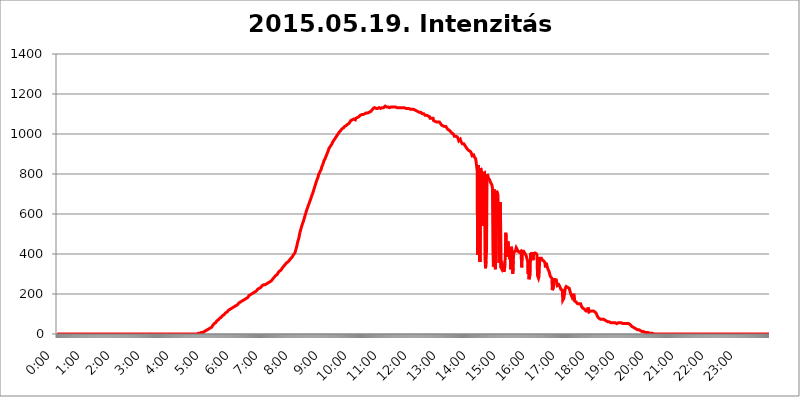
| Category | 2015.05.19. Intenzitás [W/m^2] |
|---|---|
| 0.0 | 0 |
| 0.0006944444444444445 | 0 |
| 0.001388888888888889 | 0 |
| 0.0020833333333333333 | 0 |
| 0.002777777777777778 | 0 |
| 0.003472222222222222 | 0 |
| 0.004166666666666667 | 0 |
| 0.004861111111111111 | 0 |
| 0.005555555555555556 | 0 |
| 0.0062499999999999995 | 0 |
| 0.006944444444444444 | 0 |
| 0.007638888888888889 | 0 |
| 0.008333333333333333 | 0 |
| 0.009027777777777779 | 0 |
| 0.009722222222222222 | 0 |
| 0.010416666666666666 | 0 |
| 0.011111111111111112 | 0 |
| 0.011805555555555555 | 0 |
| 0.012499999999999999 | 0 |
| 0.013194444444444444 | 0 |
| 0.013888888888888888 | 0 |
| 0.014583333333333332 | 0 |
| 0.015277777777777777 | 0 |
| 0.015972222222222224 | 0 |
| 0.016666666666666666 | 0 |
| 0.017361111111111112 | 0 |
| 0.018055555555555557 | 0 |
| 0.01875 | 0 |
| 0.019444444444444445 | 0 |
| 0.02013888888888889 | 0 |
| 0.020833333333333332 | 0 |
| 0.02152777777777778 | 0 |
| 0.022222222222222223 | 0 |
| 0.02291666666666667 | 0 |
| 0.02361111111111111 | 0 |
| 0.024305555555555556 | 0 |
| 0.024999999999999998 | 0 |
| 0.025694444444444447 | 0 |
| 0.02638888888888889 | 0 |
| 0.027083333333333334 | 0 |
| 0.027777777777777776 | 0 |
| 0.02847222222222222 | 0 |
| 0.029166666666666664 | 0 |
| 0.029861111111111113 | 0 |
| 0.030555555555555555 | 0 |
| 0.03125 | 0 |
| 0.03194444444444445 | 0 |
| 0.03263888888888889 | 0 |
| 0.03333333333333333 | 0 |
| 0.034027777777777775 | 0 |
| 0.034722222222222224 | 0 |
| 0.035416666666666666 | 0 |
| 0.036111111111111115 | 0 |
| 0.03680555555555556 | 0 |
| 0.0375 | 0 |
| 0.03819444444444444 | 0 |
| 0.03888888888888889 | 0 |
| 0.03958333333333333 | 0 |
| 0.04027777777777778 | 0 |
| 0.04097222222222222 | 0 |
| 0.041666666666666664 | 0 |
| 0.042361111111111106 | 0 |
| 0.04305555555555556 | 0 |
| 0.043750000000000004 | 0 |
| 0.044444444444444446 | 0 |
| 0.04513888888888889 | 0 |
| 0.04583333333333334 | 0 |
| 0.04652777777777778 | 0 |
| 0.04722222222222222 | 0 |
| 0.04791666666666666 | 0 |
| 0.04861111111111111 | 0 |
| 0.049305555555555554 | 0 |
| 0.049999999999999996 | 0 |
| 0.05069444444444445 | 0 |
| 0.051388888888888894 | 0 |
| 0.052083333333333336 | 0 |
| 0.05277777777777778 | 0 |
| 0.05347222222222222 | 0 |
| 0.05416666666666667 | 0 |
| 0.05486111111111111 | 0 |
| 0.05555555555555555 | 0 |
| 0.05625 | 0 |
| 0.05694444444444444 | 0 |
| 0.057638888888888885 | 0 |
| 0.05833333333333333 | 0 |
| 0.05902777777777778 | 0 |
| 0.059722222222222225 | 0 |
| 0.06041666666666667 | 0 |
| 0.061111111111111116 | 0 |
| 0.06180555555555556 | 0 |
| 0.0625 | 0 |
| 0.06319444444444444 | 0 |
| 0.06388888888888888 | 0 |
| 0.06458333333333334 | 0 |
| 0.06527777777777778 | 0 |
| 0.06597222222222222 | 0 |
| 0.06666666666666667 | 0 |
| 0.06736111111111111 | 0 |
| 0.06805555555555555 | 0 |
| 0.06874999999999999 | 0 |
| 0.06944444444444443 | 0 |
| 0.07013888888888889 | 0 |
| 0.07083333333333333 | 0 |
| 0.07152777777777779 | 0 |
| 0.07222222222222223 | 0 |
| 0.07291666666666667 | 0 |
| 0.07361111111111111 | 0 |
| 0.07430555555555556 | 0 |
| 0.075 | 0 |
| 0.07569444444444444 | 0 |
| 0.0763888888888889 | 0 |
| 0.07708333333333334 | 0 |
| 0.07777777777777778 | 0 |
| 0.07847222222222222 | 0 |
| 0.07916666666666666 | 0 |
| 0.0798611111111111 | 0 |
| 0.08055555555555556 | 0 |
| 0.08125 | 0 |
| 0.08194444444444444 | 0 |
| 0.08263888888888889 | 0 |
| 0.08333333333333333 | 0 |
| 0.08402777777777777 | 0 |
| 0.08472222222222221 | 0 |
| 0.08541666666666665 | 0 |
| 0.08611111111111112 | 0 |
| 0.08680555555555557 | 0 |
| 0.08750000000000001 | 0 |
| 0.08819444444444445 | 0 |
| 0.08888888888888889 | 0 |
| 0.08958333333333333 | 0 |
| 0.09027777777777778 | 0 |
| 0.09097222222222222 | 0 |
| 0.09166666666666667 | 0 |
| 0.09236111111111112 | 0 |
| 0.09305555555555556 | 0 |
| 0.09375 | 0 |
| 0.09444444444444444 | 0 |
| 0.09513888888888888 | 0 |
| 0.09583333333333333 | 0 |
| 0.09652777777777777 | 0 |
| 0.09722222222222222 | 0 |
| 0.09791666666666667 | 0 |
| 0.09861111111111111 | 0 |
| 0.09930555555555555 | 0 |
| 0.09999999999999999 | 0 |
| 0.10069444444444443 | 0 |
| 0.1013888888888889 | 0 |
| 0.10208333333333335 | 0 |
| 0.10277777777777779 | 0 |
| 0.10347222222222223 | 0 |
| 0.10416666666666667 | 0 |
| 0.10486111111111111 | 0 |
| 0.10555555555555556 | 0 |
| 0.10625 | 0 |
| 0.10694444444444444 | 0 |
| 0.1076388888888889 | 0 |
| 0.10833333333333334 | 0 |
| 0.10902777777777778 | 0 |
| 0.10972222222222222 | 0 |
| 0.1111111111111111 | 0 |
| 0.11180555555555556 | 0 |
| 0.11180555555555556 | 0 |
| 0.1125 | 0 |
| 0.11319444444444444 | 0 |
| 0.11388888888888889 | 0 |
| 0.11458333333333333 | 0 |
| 0.11527777777777777 | 0 |
| 0.11597222222222221 | 0 |
| 0.11666666666666665 | 0 |
| 0.1173611111111111 | 0 |
| 0.11805555555555557 | 0 |
| 0.11944444444444445 | 0 |
| 0.12013888888888889 | 0 |
| 0.12083333333333333 | 0 |
| 0.12152777777777778 | 0 |
| 0.12222222222222223 | 0 |
| 0.12291666666666667 | 0 |
| 0.12291666666666667 | 0 |
| 0.12361111111111112 | 0 |
| 0.12430555555555556 | 0 |
| 0.125 | 0 |
| 0.12569444444444444 | 0 |
| 0.12638888888888888 | 0 |
| 0.12708333333333333 | 0 |
| 0.16875 | 0 |
| 0.12847222222222224 | 0 |
| 0.12916666666666668 | 0 |
| 0.12986111111111112 | 0 |
| 0.13055555555555556 | 0 |
| 0.13125 | 0 |
| 0.13194444444444445 | 0 |
| 0.1326388888888889 | 0 |
| 0.13333333333333333 | 0 |
| 0.13402777777777777 | 0 |
| 0.13402777777777777 | 0 |
| 0.13472222222222222 | 0 |
| 0.13541666666666666 | 0 |
| 0.1361111111111111 | 0 |
| 0.13749999999999998 | 0 |
| 0.13819444444444443 | 0 |
| 0.1388888888888889 | 0 |
| 0.13958333333333334 | 0 |
| 0.14027777777777778 | 0 |
| 0.14097222222222222 | 0 |
| 0.14166666666666666 | 0 |
| 0.1423611111111111 | 0 |
| 0.14305555555555557 | 0 |
| 0.14375000000000002 | 0 |
| 0.14444444444444446 | 0 |
| 0.1451388888888889 | 0 |
| 0.1451388888888889 | 0 |
| 0.14652777777777778 | 0 |
| 0.14722222222222223 | 0 |
| 0.14791666666666667 | 0 |
| 0.1486111111111111 | 0 |
| 0.14930555555555555 | 0 |
| 0.15 | 0 |
| 0.15069444444444444 | 0 |
| 0.15138888888888888 | 0 |
| 0.15208333333333332 | 0 |
| 0.15277777777777776 | 0 |
| 0.15347222222222223 | 0 |
| 0.15416666666666667 | 0 |
| 0.15486111111111112 | 0 |
| 0.15555555555555556 | 0 |
| 0.15625 | 0 |
| 0.15694444444444444 | 0 |
| 0.15763888888888888 | 0 |
| 0.15833333333333333 | 0 |
| 0.15902777777777777 | 0 |
| 0.15972222222222224 | 0 |
| 0.16041666666666668 | 0 |
| 0.16111111111111112 | 0 |
| 0.16180555555555556 | 0 |
| 0.1625 | 0 |
| 0.16319444444444445 | 0 |
| 0.1638888888888889 | 0 |
| 0.16458333333333333 | 0 |
| 0.16527777777777777 | 0 |
| 0.16597222222222222 | 0 |
| 0.16666666666666666 | 0 |
| 0.1673611111111111 | 0 |
| 0.16805555555555554 | 0 |
| 0.16874999999999998 | 0 |
| 0.16944444444444443 | 0 |
| 0.17013888888888887 | 0 |
| 0.1708333333333333 | 0 |
| 0.17152777777777775 | 0 |
| 0.17222222222222225 | 0 |
| 0.1729166666666667 | 0 |
| 0.17361111111111113 | 0 |
| 0.17430555555555557 | 0 |
| 0.17500000000000002 | 0 |
| 0.17569444444444446 | 0 |
| 0.1763888888888889 | 0 |
| 0.17708333333333334 | 0 |
| 0.17777777777777778 | 0 |
| 0.17847222222222223 | 0 |
| 0.17916666666666667 | 0 |
| 0.1798611111111111 | 0 |
| 0.18055555555555555 | 0 |
| 0.18125 | 0 |
| 0.18194444444444444 | 0 |
| 0.1826388888888889 | 0 |
| 0.18333333333333335 | 0 |
| 0.1840277777777778 | 0 |
| 0.18472222222222223 | 0 |
| 0.18541666666666667 | 0 |
| 0.18611111111111112 | 0 |
| 0.18680555555555556 | 0 |
| 0.1875 | 0 |
| 0.18819444444444444 | 0 |
| 0.18888888888888888 | 0 |
| 0.18958333333333333 | 0 |
| 0.19027777777777777 | 0 |
| 0.1909722222222222 | 0 |
| 0.19166666666666665 | 0 |
| 0.19236111111111112 | 0 |
| 0.19305555555555554 | 0 |
| 0.19375 | 0 |
| 0.19444444444444445 | 0 |
| 0.1951388888888889 | 0 |
| 0.19583333333333333 | 0 |
| 0.19652777777777777 | 0 |
| 0.19722222222222222 | 3.525 |
| 0.19791666666666666 | 3.525 |
| 0.1986111111111111 | 3.525 |
| 0.19930555555555554 | 3.525 |
| 0.19999999999999998 | 3.525 |
| 0.20069444444444443 | 3.525 |
| 0.20138888888888887 | 3.525 |
| 0.2020833333333333 | 7.887 |
| 0.2027777777777778 | 7.887 |
| 0.2034722222222222 | 7.887 |
| 0.2041666666666667 | 7.887 |
| 0.20486111111111113 | 12.257 |
| 0.20555555555555557 | 12.257 |
| 0.20625000000000002 | 12.257 |
| 0.20694444444444446 | 12.257 |
| 0.2076388888888889 | 16.636 |
| 0.20833333333333334 | 16.636 |
| 0.20902777777777778 | 16.636 |
| 0.20972222222222223 | 21.024 |
| 0.21041666666666667 | 21.024 |
| 0.2111111111111111 | 21.024 |
| 0.21180555555555555 | 21.024 |
| 0.2125 | 25.419 |
| 0.21319444444444444 | 25.419 |
| 0.2138888888888889 | 29.823 |
| 0.21458333333333335 | 29.823 |
| 0.2152777777777778 | 29.823 |
| 0.21597222222222223 | 34.234 |
| 0.21666666666666667 | 34.234 |
| 0.21736111111111112 | 38.653 |
| 0.21805555555555556 | 43.079 |
| 0.21875 | 43.079 |
| 0.21944444444444444 | 47.511 |
| 0.22013888888888888 | 51.951 |
| 0.22083333333333333 | 51.951 |
| 0.22152777777777777 | 56.398 |
| 0.2222222222222222 | 56.398 |
| 0.22291666666666665 | 60.85 |
| 0.2236111111111111 | 65.31 |
| 0.22430555555555556 | 65.31 |
| 0.225 | 69.775 |
| 0.22569444444444445 | 69.775 |
| 0.2263888888888889 | 74.246 |
| 0.22708333333333333 | 74.246 |
| 0.22777777777777777 | 78.722 |
| 0.22847222222222222 | 78.722 |
| 0.22916666666666666 | 83.205 |
| 0.2298611111111111 | 83.205 |
| 0.23055555555555554 | 87.692 |
| 0.23124999999999998 | 87.692 |
| 0.23194444444444443 | 92.184 |
| 0.23263888888888887 | 92.184 |
| 0.2333333333333333 | 96.682 |
| 0.2340277777777778 | 96.682 |
| 0.2347222222222222 | 101.184 |
| 0.2354166666666667 | 101.184 |
| 0.23611111111111113 | 105.69 |
| 0.23680555555555557 | 105.69 |
| 0.23750000000000002 | 110.201 |
| 0.23819444444444446 | 110.201 |
| 0.2388888888888889 | 114.716 |
| 0.23958333333333334 | 114.716 |
| 0.24027777777777778 | 119.235 |
| 0.24097222222222223 | 119.235 |
| 0.24166666666666667 | 119.235 |
| 0.2423611111111111 | 123.758 |
| 0.24305555555555555 | 123.758 |
| 0.24375 | 128.284 |
| 0.24444444444444446 | 128.284 |
| 0.24513888888888888 | 128.284 |
| 0.24583333333333335 | 132.814 |
| 0.2465277777777778 | 132.814 |
| 0.24722222222222223 | 132.814 |
| 0.24791666666666667 | 137.347 |
| 0.24861111111111112 | 137.347 |
| 0.24930555555555556 | 137.347 |
| 0.25 | 141.884 |
| 0.25069444444444444 | 141.884 |
| 0.2513888888888889 | 146.423 |
| 0.2520833333333333 | 146.423 |
| 0.25277777777777777 | 146.423 |
| 0.2534722222222222 | 150.964 |
| 0.25416666666666665 | 150.964 |
| 0.2548611111111111 | 155.509 |
| 0.2555555555555556 | 155.509 |
| 0.25625000000000003 | 155.509 |
| 0.2569444444444445 | 160.056 |
| 0.2576388888888889 | 160.056 |
| 0.25833333333333336 | 164.605 |
| 0.2590277777777778 | 164.605 |
| 0.25972222222222224 | 164.605 |
| 0.2604166666666667 | 169.156 |
| 0.2611111111111111 | 169.156 |
| 0.26180555555555557 | 173.709 |
| 0.2625 | 173.709 |
| 0.26319444444444445 | 173.709 |
| 0.2638888888888889 | 173.709 |
| 0.26458333333333334 | 178.264 |
| 0.2652777777777778 | 178.264 |
| 0.2659722222222222 | 178.264 |
| 0.26666666666666666 | 182.82 |
| 0.2673611111111111 | 182.82 |
| 0.26805555555555555 | 187.378 |
| 0.26875 | 191.937 |
| 0.26944444444444443 | 191.937 |
| 0.2701388888888889 | 191.937 |
| 0.2708333333333333 | 196.497 |
| 0.27152777777777776 | 196.497 |
| 0.2722222222222222 | 201.058 |
| 0.27291666666666664 | 201.058 |
| 0.2736111111111111 | 201.058 |
| 0.2743055555555555 | 205.62 |
| 0.27499999999999997 | 205.62 |
| 0.27569444444444446 | 210.182 |
| 0.27638888888888885 | 210.182 |
| 0.27708333333333335 | 210.182 |
| 0.2777777777777778 | 210.182 |
| 0.27847222222222223 | 214.746 |
| 0.2791666666666667 | 214.746 |
| 0.2798611111111111 | 219.309 |
| 0.28055555555555556 | 219.309 |
| 0.28125 | 223.873 |
| 0.28194444444444444 | 223.873 |
| 0.2826388888888889 | 228.436 |
| 0.2833333333333333 | 228.436 |
| 0.28402777777777777 | 233 |
| 0.2847222222222222 | 233 |
| 0.28541666666666665 | 233 |
| 0.28611111111111115 | 237.564 |
| 0.28680555555555554 | 237.564 |
| 0.28750000000000003 | 242.127 |
| 0.2881944444444445 | 242.127 |
| 0.2888888888888889 | 242.127 |
| 0.28958333333333336 | 246.689 |
| 0.2902777777777778 | 246.689 |
| 0.29097222222222224 | 246.689 |
| 0.2916666666666667 | 246.689 |
| 0.2923611111111111 | 251.251 |
| 0.29305555555555557 | 251.251 |
| 0.29375 | 251.251 |
| 0.29444444444444445 | 251.251 |
| 0.2951388888888889 | 255.813 |
| 0.29583333333333334 | 255.813 |
| 0.2965277777777778 | 255.813 |
| 0.2972222222222222 | 260.373 |
| 0.29791666666666666 | 260.373 |
| 0.2986111111111111 | 264.932 |
| 0.29930555555555555 | 264.932 |
| 0.3 | 264.932 |
| 0.30069444444444443 | 264.932 |
| 0.3013888888888889 | 269.49 |
| 0.3020833333333333 | 274.047 |
| 0.30277777777777776 | 274.047 |
| 0.3034722222222222 | 278.603 |
| 0.30416666666666664 | 283.156 |
| 0.3048611111111111 | 283.156 |
| 0.3055555555555555 | 287.709 |
| 0.30624999999999997 | 292.259 |
| 0.3069444444444444 | 292.259 |
| 0.3076388888888889 | 296.808 |
| 0.30833333333333335 | 296.808 |
| 0.3090277777777778 | 301.354 |
| 0.30972222222222223 | 305.898 |
| 0.3104166666666667 | 305.898 |
| 0.3111111111111111 | 310.44 |
| 0.31180555555555556 | 314.98 |
| 0.3125 | 314.98 |
| 0.31319444444444444 | 319.517 |
| 0.3138888888888889 | 319.517 |
| 0.3145833333333333 | 324.052 |
| 0.31527777777777777 | 328.584 |
| 0.3159722222222222 | 328.584 |
| 0.31666666666666665 | 333.113 |
| 0.31736111111111115 | 337.639 |
| 0.31805555555555554 | 342.162 |
| 0.31875000000000003 | 342.162 |
| 0.3194444444444445 | 346.682 |
| 0.3201388888888889 | 346.682 |
| 0.32083333333333336 | 351.198 |
| 0.3215277777777778 | 355.712 |
| 0.32222222222222224 | 355.712 |
| 0.3229166666666667 | 360.221 |
| 0.3236111111111111 | 360.221 |
| 0.32430555555555557 | 364.728 |
| 0.325 | 364.728 |
| 0.32569444444444445 | 369.23 |
| 0.3263888888888889 | 373.729 |
| 0.32708333333333334 | 373.729 |
| 0.3277777777777778 | 378.224 |
| 0.3284722222222222 | 378.224 |
| 0.32916666666666666 | 382.715 |
| 0.3298611111111111 | 387.202 |
| 0.33055555555555555 | 391.685 |
| 0.33125 | 396.164 |
| 0.33194444444444443 | 396.164 |
| 0.3326388888888889 | 400.638 |
| 0.3333333333333333 | 405.108 |
| 0.3340277777777778 | 414.035 |
| 0.3347222222222222 | 422.943 |
| 0.3354166666666667 | 431.833 |
| 0.3361111111111111 | 440.702 |
| 0.3368055555555556 | 453.968 |
| 0.33749999999999997 | 462.786 |
| 0.33819444444444446 | 471.582 |
| 0.33888888888888885 | 480.356 |
| 0.33958333333333335 | 493.475 |
| 0.34027777777777773 | 506.542 |
| 0.34097222222222223 | 515.223 |
| 0.3416666666666666 | 523.88 |
| 0.3423611111111111 | 532.513 |
| 0.3430555555555555 | 541.121 |
| 0.34375 | 549.704 |
| 0.3444444444444445 | 553.986 |
| 0.3451388888888889 | 562.53 |
| 0.3458333333333334 | 571.049 |
| 0.34652777777777777 | 579.542 |
| 0.34722222222222227 | 588.009 |
| 0.34791666666666665 | 596.45 |
| 0.34861111111111115 | 604.864 |
| 0.34930555555555554 | 613.252 |
| 0.35000000000000003 | 621.613 |
| 0.3506944444444444 | 625.784 |
| 0.3513888888888889 | 634.105 |
| 0.3520833333333333 | 642.4 |
| 0.3527777777777778 | 646.537 |
| 0.3534722222222222 | 654.791 |
| 0.3541666666666667 | 663.019 |
| 0.3548611111111111 | 667.123 |
| 0.35555555555555557 | 675.311 |
| 0.35625 | 683.473 |
| 0.35694444444444445 | 691.608 |
| 0.3576388888888889 | 695.666 |
| 0.35833333333333334 | 703.762 |
| 0.3590277777777778 | 711.832 |
| 0.3597222222222222 | 719.877 |
| 0.36041666666666666 | 727.896 |
| 0.3611111111111111 | 731.896 |
| 0.36180555555555555 | 743.859 |
| 0.3625 | 751.803 |
| 0.36319444444444443 | 759.723 |
| 0.3638888888888889 | 767.62 |
| 0.3645833333333333 | 771.559 |
| 0.3652777777777778 | 779.42 |
| 0.3659722222222222 | 787.258 |
| 0.3666666666666667 | 798.974 |
| 0.3673611111111111 | 798.974 |
| 0.3680555555555556 | 806.757 |
| 0.36874999999999997 | 814.519 |
| 0.36944444444444446 | 818.392 |
| 0.37013888888888885 | 822.26 |
| 0.37083333333333335 | 833.834 |
| 0.37152777777777773 | 837.682 |
| 0.37222222222222223 | 845.365 |
| 0.3729166666666666 | 853.029 |
| 0.3736111111111111 | 860.676 |
| 0.3743055555555555 | 868.305 |
| 0.375 | 872.114 |
| 0.3756944444444445 | 875.918 |
| 0.3763888888888889 | 883.516 |
| 0.3770833333333334 | 887.309 |
| 0.37777777777777777 | 894.885 |
| 0.37847222222222227 | 902.447 |
| 0.37916666666666665 | 906.223 |
| 0.37986111111111115 | 913.766 |
| 0.38055555555555554 | 921.298 |
| 0.38125000000000003 | 928.819 |
| 0.3819444444444444 | 932.576 |
| 0.3826388888888889 | 936.33 |
| 0.3833333333333333 | 940.082 |
| 0.3840277777777778 | 943.832 |
| 0.3847222222222222 | 947.58 |
| 0.3854166666666667 | 951.327 |
| 0.3861111111111111 | 958.814 |
| 0.38680555555555557 | 962.555 |
| 0.3875 | 966.295 |
| 0.38819444444444445 | 970.034 |
| 0.3888888888888889 | 973.772 |
| 0.38958333333333334 | 977.508 |
| 0.3902777777777778 | 981.244 |
| 0.3909722222222222 | 984.98 |
| 0.39166666666666666 | 988.714 |
| 0.3923611111111111 | 992.448 |
| 0.39305555555555555 | 996.182 |
| 0.39375 | 996.182 |
| 0.39444444444444443 | 1003.65 |
| 0.3951388888888889 | 1007.383 |
| 0.3958333333333333 | 1011.118 |
| 0.3965277777777778 | 1014.852 |
| 0.3972222222222222 | 1014.852 |
| 0.3979166666666667 | 1018.587 |
| 0.3986111111111111 | 1022.323 |
| 0.3993055555555556 | 1026.06 |
| 0.39999999999999997 | 1026.06 |
| 0.40069444444444446 | 1026.06 |
| 0.40138888888888885 | 1029.798 |
| 0.40208333333333335 | 1033.537 |
| 0.40277777777777773 | 1037.277 |
| 0.40347222222222223 | 1037.277 |
| 0.4041666666666666 | 1041.019 |
| 0.4048611111111111 | 1041.019 |
| 0.4055555555555555 | 1044.762 |
| 0.40625 | 1044.762 |
| 0.4069444444444445 | 1048.508 |
| 0.4076388888888889 | 1048.508 |
| 0.4083333333333334 | 1052.255 |
| 0.40902777777777777 | 1052.255 |
| 0.40972222222222227 | 1056.004 |
| 0.41041666666666665 | 1059.756 |
| 0.41111111111111115 | 1059.756 |
| 0.41180555555555554 | 1067.267 |
| 0.41250000000000003 | 1067.267 |
| 0.4131944444444444 | 1071.027 |
| 0.4138888888888889 | 1071.027 |
| 0.4145833333333333 | 1071.027 |
| 0.4152777777777778 | 1074.789 |
| 0.4159722222222222 | 1074.789 |
| 0.4166666666666667 | 1074.789 |
| 0.4173611111111111 | 1074.789 |
| 0.41805555555555557 | 1071.027 |
| 0.41875 | 1078.555 |
| 0.41944444444444445 | 1078.555 |
| 0.4201388888888889 | 1082.324 |
| 0.42083333333333334 | 1082.324 |
| 0.4215277777777778 | 1082.324 |
| 0.4222222222222222 | 1086.097 |
| 0.42291666666666666 | 1086.097 |
| 0.4236111111111111 | 1086.097 |
| 0.42430555555555555 | 1089.873 |
| 0.425 | 1093.653 |
| 0.42569444444444443 | 1093.653 |
| 0.4263888888888889 | 1093.653 |
| 0.4270833333333333 | 1097.437 |
| 0.4277777777777778 | 1097.437 |
| 0.4284722222222222 | 1097.437 |
| 0.4291666666666667 | 1097.437 |
| 0.4298611111111111 | 1101.226 |
| 0.4305555555555556 | 1101.226 |
| 0.43124999999999997 | 1101.226 |
| 0.43194444444444446 | 1105.019 |
| 0.43263888888888885 | 1101.226 |
| 0.43333333333333335 | 1105.019 |
| 0.43402777777777773 | 1105.019 |
| 0.43472222222222223 | 1108.816 |
| 0.4354166666666666 | 1105.019 |
| 0.4361111111111111 | 1105.019 |
| 0.4368055555555555 | 1108.816 |
| 0.4375 | 1108.816 |
| 0.4381944444444445 | 1112.618 |
| 0.4388888888888889 | 1112.618 |
| 0.4395833333333334 | 1112.618 |
| 0.44027777777777777 | 1112.618 |
| 0.44097222222222227 | 1116.426 |
| 0.44166666666666665 | 1120.238 |
| 0.44236111111111115 | 1124.056 |
| 0.44305555555555554 | 1127.879 |
| 0.44375000000000003 | 1124.056 |
| 0.4444444444444444 | 1127.879 |
| 0.4451388888888889 | 1131.708 |
| 0.4458333333333333 | 1127.879 |
| 0.4465277777777778 | 1127.879 |
| 0.4472222222222222 | 1127.879 |
| 0.4479166666666667 | 1127.879 |
| 0.4486111111111111 | 1131.708 |
| 0.44930555555555557 | 1127.879 |
| 0.45 | 1131.708 |
| 0.45069444444444445 | 1131.708 |
| 0.4513888888888889 | 1131.708 |
| 0.45208333333333334 | 1127.879 |
| 0.4527777777777778 | 1127.879 |
| 0.4534722222222222 | 1127.879 |
| 0.45416666666666666 | 1131.708 |
| 0.4548611111111111 | 1131.708 |
| 0.45555555555555555 | 1131.708 |
| 0.45625 | 1131.708 |
| 0.45694444444444443 | 1131.708 |
| 0.4576388888888889 | 1131.708 |
| 0.4583333333333333 | 1131.708 |
| 0.4590277777777778 | 1131.708 |
| 0.4597222222222222 | 1139.384 |
| 0.4604166666666667 | 1135.543 |
| 0.4611111111111111 | 1135.543 |
| 0.4618055555555556 | 1135.543 |
| 0.46249999999999997 | 1135.543 |
| 0.46319444444444446 | 1135.543 |
| 0.46388888888888885 | 1135.543 |
| 0.46458333333333335 | 1135.543 |
| 0.46527777777777773 | 1135.543 |
| 0.46597222222222223 | 1131.708 |
| 0.4666666666666666 | 1135.543 |
| 0.4673611111111111 | 1135.543 |
| 0.4680555555555555 | 1135.543 |
| 0.46875 | 1135.543 |
| 0.4694444444444445 | 1135.543 |
| 0.4701388888888889 | 1135.543 |
| 0.4708333333333334 | 1135.543 |
| 0.47152777777777777 | 1135.543 |
| 0.47222222222222227 | 1135.543 |
| 0.47291666666666665 | 1135.543 |
| 0.47361111111111115 | 1135.543 |
| 0.47430555555555554 | 1135.543 |
| 0.47500000000000003 | 1135.543 |
| 0.4756944444444444 | 1131.708 |
| 0.4763888888888889 | 1131.708 |
| 0.4770833333333333 | 1131.708 |
| 0.4777777777777778 | 1131.708 |
| 0.4784722222222222 | 1131.708 |
| 0.4791666666666667 | 1131.708 |
| 0.4798611111111111 | 1131.708 |
| 0.48055555555555557 | 1131.708 |
| 0.48125 | 1131.708 |
| 0.48194444444444445 | 1131.708 |
| 0.4826388888888889 | 1131.708 |
| 0.48333333333333334 | 1131.708 |
| 0.4840277777777778 | 1131.708 |
| 0.4847222222222222 | 1131.708 |
| 0.48541666666666666 | 1131.708 |
| 0.4861111111111111 | 1131.708 |
| 0.48680555555555555 | 1131.708 |
| 0.4875 | 1131.708 |
| 0.48819444444444443 | 1127.879 |
| 0.4888888888888889 | 1127.879 |
| 0.4895833333333333 | 1127.879 |
| 0.4902777777777778 | 1127.879 |
| 0.4909722222222222 | 1127.879 |
| 0.4916666666666667 | 1124.056 |
| 0.4923611111111111 | 1127.879 |
| 0.4930555555555556 | 1127.879 |
| 0.49374999999999997 | 1124.056 |
| 0.49444444444444446 | 1124.056 |
| 0.49513888888888885 | 1124.056 |
| 0.49583333333333335 | 1124.056 |
| 0.49652777777777773 | 1124.056 |
| 0.49722222222222223 | 1124.056 |
| 0.4979166666666666 | 1124.056 |
| 0.4986111111111111 | 1124.056 |
| 0.4993055555555555 | 1124.056 |
| 0.5 | 1124.056 |
| 0.5006944444444444 | 1120.238 |
| 0.5013888888888889 | 1120.238 |
| 0.5020833333333333 | 1116.426 |
| 0.5027777777777778 | 1116.426 |
| 0.5034722222222222 | 1116.426 |
| 0.5041666666666667 | 1116.426 |
| 0.5048611111111111 | 1112.618 |
| 0.5055555555555555 | 1112.618 |
| 0.50625 | 1112.618 |
| 0.5069444444444444 | 1112.618 |
| 0.5076388888888889 | 1108.816 |
| 0.5083333333333333 | 1108.816 |
| 0.5090277777777777 | 1108.816 |
| 0.5097222222222222 | 1108.816 |
| 0.5104166666666666 | 1105.019 |
| 0.5111111111111112 | 1105.019 |
| 0.5118055555555555 | 1101.226 |
| 0.5125000000000001 | 1101.226 |
| 0.5131944444444444 | 1101.226 |
| 0.513888888888889 | 1101.226 |
| 0.5145833333333333 | 1101.226 |
| 0.5152777777777778 | 1097.437 |
| 0.5159722222222222 | 1093.653 |
| 0.5166666666666667 | 1093.653 |
| 0.517361111111111 | 1093.653 |
| 0.5180555555555556 | 1093.653 |
| 0.5187499999999999 | 1089.873 |
| 0.5194444444444445 | 1089.873 |
| 0.5201388888888888 | 1089.873 |
| 0.5208333333333334 | 1089.873 |
| 0.5215277777777778 | 1086.097 |
| 0.5222222222222223 | 1086.097 |
| 0.5229166666666667 | 1078.555 |
| 0.5236111111111111 | 1078.555 |
| 0.5243055555555556 | 1078.555 |
| 0.525 | 1078.555 |
| 0.5256944444444445 | 1082.324 |
| 0.5263888888888889 | 1078.555 |
| 0.5270833333333333 | 1078.555 |
| 0.5277777777777778 | 1067.267 |
| 0.5284722222222222 | 1067.267 |
| 0.5291666666666667 | 1063.51 |
| 0.5298611111111111 | 1063.51 |
| 0.5305555555555556 | 1063.51 |
| 0.53125 | 1059.756 |
| 0.5319444444444444 | 1059.756 |
| 0.5326388888888889 | 1059.756 |
| 0.5333333333333333 | 1063.51 |
| 0.5340277777777778 | 1059.756 |
| 0.5347222222222222 | 1059.756 |
| 0.5354166666666667 | 1056.004 |
| 0.5361111111111111 | 1059.756 |
| 0.5368055555555555 | 1056.004 |
| 0.5375 | 1052.255 |
| 0.5381944444444444 | 1048.508 |
| 0.5388888888888889 | 1044.762 |
| 0.5395833333333333 | 1044.762 |
| 0.5402777777777777 | 1044.762 |
| 0.5409722222222222 | 1041.019 |
| 0.5416666666666666 | 1041.019 |
| 0.5423611111111112 | 1037.277 |
| 0.5430555555555555 | 1037.277 |
| 0.5437500000000001 | 1037.277 |
| 0.5444444444444444 | 1037.277 |
| 0.545138888888889 | 1037.277 |
| 0.5458333333333333 | 1033.537 |
| 0.5465277777777778 | 1029.798 |
| 0.5472222222222222 | 1026.06 |
| 0.5479166666666667 | 1022.323 |
| 0.548611111111111 | 1022.323 |
| 0.5493055555555556 | 1018.587 |
| 0.5499999999999999 | 1018.587 |
| 0.5506944444444445 | 1014.852 |
| 0.5513888888888888 | 1014.852 |
| 0.5520833333333334 | 1011.118 |
| 0.5527777777777778 | 1007.383 |
| 0.5534722222222223 | 1003.65 |
| 0.5541666666666667 | 1003.65 |
| 0.5548611111111111 | 999.916 |
| 0.5555555555555556 | 999.916 |
| 0.55625 | 996.182 |
| 0.5569444444444445 | 988.714 |
| 0.5576388888888889 | 984.98 |
| 0.5583333333333333 | 988.714 |
| 0.5590277777777778 | 988.714 |
| 0.5597222222222222 | 988.714 |
| 0.5604166666666667 | 984.98 |
| 0.5611111111111111 | 984.98 |
| 0.5618055555555556 | 981.244 |
| 0.5625 | 973.772 |
| 0.5631944444444444 | 966.295 |
| 0.5638888888888889 | 970.034 |
| 0.5645833333333333 | 970.034 |
| 0.5652777777777778 | 973.772 |
| 0.5659722222222222 | 966.295 |
| 0.5666666666666667 | 958.814 |
| 0.5673611111111111 | 958.814 |
| 0.5680555555555555 | 951.327 |
| 0.56875 | 951.327 |
| 0.5694444444444444 | 955.071 |
| 0.5701388888888889 | 951.327 |
| 0.5708333333333333 | 951.327 |
| 0.5715277777777777 | 947.58 |
| 0.5722222222222222 | 940.082 |
| 0.5729166666666666 | 936.33 |
| 0.5736111111111112 | 932.576 |
| 0.5743055555555555 | 928.819 |
| 0.5750000000000001 | 925.06 |
| 0.5756944444444444 | 925.06 |
| 0.576388888888889 | 921.298 |
| 0.5770833333333333 | 917.534 |
| 0.5777777777777778 | 921.298 |
| 0.5784722222222222 | 917.534 |
| 0.5791666666666667 | 913.766 |
| 0.579861111111111 | 909.996 |
| 0.5805555555555556 | 906.223 |
| 0.5812499999999999 | 898.668 |
| 0.5819444444444445 | 891.099 |
| 0.5826388888888888 | 887.309 |
| 0.5833333333333334 | 891.099 |
| 0.5840277777777778 | 894.885 |
| 0.5847222222222223 | 887.309 |
| 0.5854166666666667 | 887.309 |
| 0.5861111111111111 | 887.309 |
| 0.5868055555555556 | 875.918 |
| 0.5875 | 860.676 |
| 0.5881944444444445 | 856.855 |
| 0.5888888888888889 | 818.392 |
| 0.5895833333333333 | 396.164 |
| 0.5902777777777778 | 845.365 |
| 0.5909722222222222 | 841.526 |
| 0.5916666666666667 | 841.526 |
| 0.5923611111111111 | 369.23 |
| 0.5930555555555556 | 360.221 |
| 0.59375 | 829.981 |
| 0.5944444444444444 | 822.26 |
| 0.5951388888888889 | 810.641 |
| 0.5958333333333333 | 814.519 |
| 0.5965277777777778 | 541.121 |
| 0.5972222222222222 | 802.868 |
| 0.5979166666666667 | 806.757 |
| 0.5986111111111111 | 806.757 |
| 0.5993055555555555 | 806.757 |
| 0.6 | 378.224 |
| 0.6006944444444444 | 328.584 |
| 0.6013888888888889 | 364.728 |
| 0.6020833333333333 | 418.492 |
| 0.6027777777777777 | 798.974 |
| 0.6034722222222222 | 795.074 |
| 0.6041666666666666 | 787.258 |
| 0.6048611111111112 | 779.42 |
| 0.6055555555555555 | 775.492 |
| 0.6062500000000001 | 771.559 |
| 0.6069444444444444 | 767.62 |
| 0.607638888888889 | 759.723 |
| 0.6083333333333333 | 763.674 |
| 0.6090277777777778 | 759.723 |
| 0.6097222222222222 | 743.859 |
| 0.6104166666666667 | 727.896 |
| 0.611111111111111 | 422.943 |
| 0.6118055555555556 | 337.639 |
| 0.6124999999999999 | 723.889 |
| 0.6131944444444445 | 723.889 |
| 0.6138888888888888 | 337.639 |
| 0.6145833333333334 | 324.052 |
| 0.6152777777777778 | 440.702 |
| 0.6159722222222223 | 715.858 |
| 0.6166666666666667 | 711.832 |
| 0.6173611111111111 | 703.762 |
| 0.6180555555555556 | 695.666 |
| 0.61875 | 600.661 |
| 0.6194444444444445 | 355.712 |
| 0.6201388888888889 | 369.23 |
| 0.6208333333333333 | 387.202 |
| 0.6215277777777778 | 658.909 |
| 0.6222222222222222 | 333.113 |
| 0.6229166666666667 | 328.584 |
| 0.6236111111111111 | 324.052 |
| 0.6243055555555556 | 324.052 |
| 0.625 | 342.162 |
| 0.6256944444444444 | 333.113 |
| 0.6263888888888889 | 310.44 |
| 0.6270833333333333 | 314.98 |
| 0.6277777777777778 | 337.639 |
| 0.6284722222222222 | 396.164 |
| 0.6291666666666667 | 506.542 |
| 0.6298611111111111 | 422.943 |
| 0.6305555555555555 | 449.551 |
| 0.63125 | 387.202 |
| 0.6319444444444444 | 462.786 |
| 0.6326388888888889 | 449.551 |
| 0.6333333333333333 | 445.129 |
| 0.6340277777777777 | 445.129 |
| 0.6347222222222222 | 373.729 |
| 0.6354166666666666 | 431.833 |
| 0.6361111111111112 | 324.052 |
| 0.6368055555555555 | 436.27 |
| 0.6375000000000001 | 422.943 |
| 0.6381944444444444 | 405.108 |
| 0.638888888888889 | 301.354 |
| 0.6395833333333333 | 369.23 |
| 0.6402777777777778 | 409.574 |
| 0.6409722222222222 | 414.035 |
| 0.6416666666666667 | 409.574 |
| 0.642361111111111 | 414.035 |
| 0.6430555555555556 | 422.943 |
| 0.6437499999999999 | 431.833 |
| 0.6444444444444445 | 427.39 |
| 0.6451388888888888 | 422.943 |
| 0.6458333333333334 | 414.035 |
| 0.6465277777777778 | 409.574 |
| 0.6472222222222223 | 409.574 |
| 0.6479166666666667 | 409.574 |
| 0.6486111111111111 | 414.035 |
| 0.6493055555555556 | 405.108 |
| 0.65 | 414.035 |
| 0.6506944444444445 | 396.164 |
| 0.6513888888888889 | 333.113 |
| 0.6520833333333333 | 414.035 |
| 0.6527777777777778 | 418.492 |
| 0.6534722222222222 | 418.492 |
| 0.6541666666666667 | 414.035 |
| 0.6548611111111111 | 409.574 |
| 0.6555555555555556 | 405.108 |
| 0.65625 | 405.108 |
| 0.6569444444444444 | 400.638 |
| 0.6576388888888889 | 391.685 |
| 0.6583333333333333 | 391.685 |
| 0.6590277777777778 | 387.202 |
| 0.6597222222222222 | 364.728 |
| 0.6604166666666667 | 301.354 |
| 0.6611111111111111 | 369.23 |
| 0.6618055555555555 | 274.047 |
| 0.6625 | 278.603 |
| 0.6631944444444444 | 301.354 |
| 0.6638888888888889 | 405.108 |
| 0.6645833333333333 | 405.108 |
| 0.6652777777777777 | 382.715 |
| 0.6659722222222222 | 409.574 |
| 0.6666666666666666 | 409.574 |
| 0.6673611111111111 | 369.23 |
| 0.6680555555555556 | 400.638 |
| 0.6687500000000001 | 405.108 |
| 0.6694444444444444 | 405.108 |
| 0.6701388888888888 | 405.108 |
| 0.6708333333333334 | 405.108 |
| 0.6715277777777778 | 400.638 |
| 0.6722222222222222 | 400.638 |
| 0.6729166666666666 | 391.685 |
| 0.6736111111111112 | 292.259 |
| 0.6743055555555556 | 287.709 |
| 0.6749999999999999 | 278.603 |
| 0.6756944444444444 | 287.709 |
| 0.6763888888888889 | 355.712 |
| 0.6770833333333334 | 378.224 |
| 0.6777777777777777 | 382.715 |
| 0.6784722222222223 | 382.715 |
| 0.6791666666666667 | 378.224 |
| 0.6798611111111111 | 373.729 |
| 0.6805555555555555 | 369.23 |
| 0.68125 | 364.728 |
| 0.6819444444444445 | 364.728 |
| 0.6826388888888889 | 364.728 |
| 0.6833333333333332 | 364.728 |
| 0.6840277777777778 | 355.712 |
| 0.6847222222222222 | 333.113 |
| 0.6854166666666667 | 355.712 |
| 0.686111111111111 | 351.198 |
| 0.6868055555555556 | 342.162 |
| 0.6875 | 333.113 |
| 0.6881944444444444 | 324.052 |
| 0.688888888888889 | 324.052 |
| 0.6895833333333333 | 314.98 |
| 0.6902777777777778 | 305.898 |
| 0.6909722222222222 | 296.808 |
| 0.6916666666666668 | 287.709 |
| 0.6923611111111111 | 292.259 |
| 0.6930555555555555 | 292.259 |
| 0.69375 | 278.603 |
| 0.6944444444444445 | 219.309 |
| 0.6951388888888889 | 223.873 |
| 0.6958333333333333 | 233 |
| 0.6965277777777777 | 246.689 |
| 0.6972222222222223 | 278.603 |
| 0.6979166666666666 | 269.49 |
| 0.6986111111111111 | 264.932 |
| 0.6993055555555556 | 269.49 |
| 0.7000000000000001 | 269.49 |
| 0.7006944444444444 | 255.813 |
| 0.7013888888888888 | 242.127 |
| 0.7020833333333334 | 237.564 |
| 0.7027777777777778 | 242.127 |
| 0.7034722222222222 | 246.689 |
| 0.7041666666666666 | 242.127 |
| 0.7048611111111112 | 237.564 |
| 0.7055555555555556 | 233 |
| 0.7062499999999999 | 223.873 |
| 0.7069444444444444 | 219.309 |
| 0.7076388888888889 | 219.309 |
| 0.7083333333333334 | 219.309 |
| 0.7090277777777777 | 169.156 |
| 0.7097222222222223 | 173.709 |
| 0.7104166666666667 | 178.264 |
| 0.7111111111111111 | 182.82 |
| 0.7118055555555555 | 210.182 |
| 0.7125 | 228.436 |
| 0.7131944444444445 | 233 |
| 0.7138888888888889 | 237.564 |
| 0.7145833333333332 | 237.564 |
| 0.7152777777777778 | 233 |
| 0.7159722222222222 | 233 |
| 0.7166666666666667 | 233 |
| 0.717361111111111 | 233 |
| 0.7180555555555556 | 228.436 |
| 0.71875 | 233 |
| 0.7194444444444444 | 223.873 |
| 0.720138888888889 | 201.058 |
| 0.7208333333333333 | 201.058 |
| 0.7215277777777778 | 201.058 |
| 0.7222222222222222 | 182.82 |
| 0.7229166666666668 | 178.264 |
| 0.7236111111111111 | 178.264 |
| 0.7243055555555555 | 201.058 |
| 0.725 | 196.497 |
| 0.7256944444444445 | 164.605 |
| 0.7263888888888889 | 164.605 |
| 0.7270833333333333 | 164.605 |
| 0.7277777777777777 | 160.056 |
| 0.7284722222222223 | 155.509 |
| 0.7291666666666666 | 155.509 |
| 0.7298611111111111 | 150.964 |
| 0.7305555555555556 | 150.964 |
| 0.7312500000000001 | 155.509 |
| 0.7319444444444444 | 150.964 |
| 0.7326388888888888 | 150.964 |
| 0.7333333333333334 | 150.964 |
| 0.7340277777777778 | 150.964 |
| 0.7347222222222222 | 146.423 |
| 0.7354166666666666 | 137.347 |
| 0.7361111111111112 | 132.814 |
| 0.7368055555555556 | 132.814 |
| 0.7374999999999999 | 128.284 |
| 0.7381944444444444 | 128.284 |
| 0.7388888888888889 | 128.284 |
| 0.7395833333333334 | 123.758 |
| 0.7402777777777777 | 119.235 |
| 0.7409722222222223 | 123.758 |
| 0.7416666666666667 | 114.716 |
| 0.7423611111111111 | 110.201 |
| 0.7430555555555555 | 110.201 |
| 0.74375 | 114.716 |
| 0.7444444444444445 | 132.814 |
| 0.7451388888888889 | 132.814 |
| 0.7458333333333332 | 110.201 |
| 0.7465277777777778 | 110.201 |
| 0.7472222222222222 | 114.716 |
| 0.7479166666666667 | 114.716 |
| 0.748611111111111 | 114.716 |
| 0.7493055555555556 | 114.716 |
| 0.75 | 114.716 |
| 0.7506944444444444 | 114.716 |
| 0.751388888888889 | 119.235 |
| 0.7520833333333333 | 114.716 |
| 0.7527777777777778 | 114.716 |
| 0.7534722222222222 | 110.201 |
| 0.7541666666666668 | 110.201 |
| 0.7548611111111111 | 110.201 |
| 0.7555555555555555 | 105.69 |
| 0.75625 | 101.184 |
| 0.7569444444444445 | 101.184 |
| 0.7576388888888889 | 87.692 |
| 0.7583333333333333 | 83.205 |
| 0.7590277777777777 | 83.205 |
| 0.7597222222222223 | 78.722 |
| 0.7604166666666666 | 74.246 |
| 0.7611111111111111 | 74.246 |
| 0.7618055555555556 | 74.246 |
| 0.7625000000000001 | 74.246 |
| 0.7631944444444444 | 74.246 |
| 0.7638888888888888 | 74.246 |
| 0.7645833333333334 | 74.246 |
| 0.7652777777777778 | 74.246 |
| 0.7659722222222222 | 74.246 |
| 0.7666666666666666 | 74.246 |
| 0.7673611111111112 | 74.246 |
| 0.7680555555555556 | 69.775 |
| 0.7687499999999999 | 69.775 |
| 0.7694444444444444 | 65.31 |
| 0.7701388888888889 | 65.31 |
| 0.7708333333333334 | 65.31 |
| 0.7715277777777777 | 60.85 |
| 0.7722222222222223 | 60.85 |
| 0.7729166666666667 | 60.85 |
| 0.7736111111111111 | 60.85 |
| 0.7743055555555555 | 60.85 |
| 0.775 | 60.85 |
| 0.7756944444444445 | 56.398 |
| 0.7763888888888889 | 56.398 |
| 0.7770833333333332 | 56.398 |
| 0.7777777777777778 | 56.398 |
| 0.7784722222222222 | 56.398 |
| 0.7791666666666667 | 56.398 |
| 0.779861111111111 | 56.398 |
| 0.7805555555555556 | 56.398 |
| 0.78125 | 56.398 |
| 0.7819444444444444 | 56.398 |
| 0.782638888888889 | 56.398 |
| 0.7833333333333333 | 56.398 |
| 0.7840277777777778 | 56.398 |
| 0.7847222222222222 | 51.951 |
| 0.7854166666666668 | 51.951 |
| 0.7861111111111111 | 56.398 |
| 0.7868055555555555 | 56.398 |
| 0.7875 | 56.398 |
| 0.7881944444444445 | 56.398 |
| 0.7888888888888889 | 56.398 |
| 0.7895833333333333 | 56.398 |
| 0.7902777777777777 | 56.398 |
| 0.7909722222222223 | 56.398 |
| 0.7916666666666666 | 51.951 |
| 0.7923611111111111 | 51.951 |
| 0.7930555555555556 | 51.951 |
| 0.7937500000000001 | 51.951 |
| 0.7944444444444444 | 51.951 |
| 0.7951388888888888 | 51.951 |
| 0.7958333333333334 | 51.951 |
| 0.7965277777777778 | 51.951 |
| 0.7972222222222222 | 51.951 |
| 0.7979166666666666 | 51.951 |
| 0.7986111111111112 | 51.951 |
| 0.7993055555555556 | 51.951 |
| 0.7999999999999999 | 51.951 |
| 0.8006944444444444 | 51.951 |
| 0.8013888888888889 | 51.951 |
| 0.8020833333333334 | 51.951 |
| 0.8027777777777777 | 51.951 |
| 0.8034722222222223 | 47.511 |
| 0.8041666666666667 | 47.511 |
| 0.8048611111111111 | 43.079 |
| 0.8055555555555555 | 38.653 |
| 0.80625 | 38.653 |
| 0.8069444444444445 | 34.234 |
| 0.8076388888888889 | 34.234 |
| 0.8083333333333332 | 29.823 |
| 0.8090277777777778 | 29.823 |
| 0.8097222222222222 | 29.823 |
| 0.8104166666666667 | 29.823 |
| 0.811111111111111 | 29.823 |
| 0.8118055555555556 | 25.419 |
| 0.8125 | 25.419 |
| 0.8131944444444444 | 21.024 |
| 0.813888888888889 | 21.024 |
| 0.8145833333333333 | 21.024 |
| 0.8152777777777778 | 21.024 |
| 0.8159722222222222 | 21.024 |
| 0.8166666666666668 | 16.636 |
| 0.8173611111111111 | 16.636 |
| 0.8180555555555555 | 16.636 |
| 0.81875 | 16.636 |
| 0.8194444444444445 | 12.257 |
| 0.8201388888888889 | 12.257 |
| 0.8208333333333333 | 12.257 |
| 0.8215277777777777 | 12.257 |
| 0.8222222222222223 | 12.257 |
| 0.8229166666666666 | 12.257 |
| 0.8236111111111111 | 7.887 |
| 0.8243055555555556 | 7.887 |
| 0.8250000000000001 | 7.887 |
| 0.8256944444444444 | 7.887 |
| 0.8263888888888888 | 7.887 |
| 0.8270833333333334 | 7.887 |
| 0.8277777777777778 | 3.525 |
| 0.8284722222222222 | 7.887 |
| 0.8291666666666666 | 3.525 |
| 0.8298611111111112 | 3.525 |
| 0.8305555555555556 | 3.525 |
| 0.8312499999999999 | 3.525 |
| 0.8319444444444444 | 3.525 |
| 0.8326388888888889 | 3.525 |
| 0.8333333333333334 | 3.525 |
| 0.8340277777777777 | 3.525 |
| 0.8347222222222223 | 3.525 |
| 0.8354166666666667 | 3.525 |
| 0.8361111111111111 | 0 |
| 0.8368055555555555 | 0 |
| 0.8375 | 0 |
| 0.8381944444444445 | 0 |
| 0.8388888888888889 | 0 |
| 0.8395833333333332 | 0 |
| 0.8402777777777778 | 0 |
| 0.8409722222222222 | 0 |
| 0.8416666666666667 | 0 |
| 0.842361111111111 | 0 |
| 0.8430555555555556 | 0 |
| 0.84375 | 0 |
| 0.8444444444444444 | 0 |
| 0.845138888888889 | 0 |
| 0.8458333333333333 | 0 |
| 0.8465277777777778 | 0 |
| 0.8472222222222222 | 0 |
| 0.8479166666666668 | 0 |
| 0.8486111111111111 | 0 |
| 0.8493055555555555 | 0 |
| 0.85 | 0 |
| 0.8506944444444445 | 0 |
| 0.8513888888888889 | 0 |
| 0.8520833333333333 | 0 |
| 0.8527777777777777 | 0 |
| 0.8534722222222223 | 0 |
| 0.8541666666666666 | 0 |
| 0.8548611111111111 | 0 |
| 0.8555555555555556 | 0 |
| 0.8562500000000001 | 0 |
| 0.8569444444444444 | 0 |
| 0.8576388888888888 | 0 |
| 0.8583333333333334 | 0 |
| 0.8590277777777778 | 0 |
| 0.8597222222222222 | 0 |
| 0.8604166666666666 | 0 |
| 0.8611111111111112 | 0 |
| 0.8618055555555556 | 0 |
| 0.8624999999999999 | 0 |
| 0.8631944444444444 | 0 |
| 0.8638888888888889 | 0 |
| 0.8645833333333334 | 0 |
| 0.8652777777777777 | 0 |
| 0.8659722222222223 | 0 |
| 0.8666666666666667 | 0 |
| 0.8673611111111111 | 0 |
| 0.8680555555555555 | 0 |
| 0.86875 | 0 |
| 0.8694444444444445 | 0 |
| 0.8701388888888889 | 0 |
| 0.8708333333333332 | 0 |
| 0.8715277777777778 | 0 |
| 0.8722222222222222 | 0 |
| 0.8729166666666667 | 0 |
| 0.873611111111111 | 0 |
| 0.8743055555555556 | 0 |
| 0.875 | 0 |
| 0.8756944444444444 | 0 |
| 0.876388888888889 | 0 |
| 0.8770833333333333 | 0 |
| 0.8777777777777778 | 0 |
| 0.8784722222222222 | 0 |
| 0.8791666666666668 | 0 |
| 0.8798611111111111 | 0 |
| 0.8805555555555555 | 0 |
| 0.88125 | 0 |
| 0.8819444444444445 | 0 |
| 0.8826388888888889 | 0 |
| 0.8833333333333333 | 0 |
| 0.8840277777777777 | 0 |
| 0.8847222222222223 | 0 |
| 0.8854166666666666 | 0 |
| 0.8861111111111111 | 0 |
| 0.8868055555555556 | 0 |
| 0.8875000000000001 | 0 |
| 0.8881944444444444 | 0 |
| 0.8888888888888888 | 0 |
| 0.8895833333333334 | 0 |
| 0.8902777777777778 | 0 |
| 0.8909722222222222 | 0 |
| 0.8916666666666666 | 0 |
| 0.8923611111111112 | 0 |
| 0.8930555555555556 | 0 |
| 0.8937499999999999 | 0 |
| 0.8944444444444444 | 0 |
| 0.8951388888888889 | 0 |
| 0.8958333333333334 | 0 |
| 0.8965277777777777 | 0 |
| 0.8972222222222223 | 0 |
| 0.8979166666666667 | 0 |
| 0.8986111111111111 | 0 |
| 0.8993055555555555 | 0 |
| 0.9 | 0 |
| 0.9006944444444445 | 0 |
| 0.9013888888888889 | 0 |
| 0.9020833333333332 | 0 |
| 0.9027777777777778 | 0 |
| 0.9034722222222222 | 0 |
| 0.9041666666666667 | 0 |
| 0.904861111111111 | 0 |
| 0.9055555555555556 | 0 |
| 0.90625 | 0 |
| 0.9069444444444444 | 0 |
| 0.907638888888889 | 0 |
| 0.9083333333333333 | 0 |
| 0.9090277777777778 | 0 |
| 0.9097222222222222 | 0 |
| 0.9104166666666668 | 0 |
| 0.9111111111111111 | 0 |
| 0.9118055555555555 | 0 |
| 0.9125 | 0 |
| 0.9131944444444445 | 0 |
| 0.9138888888888889 | 0 |
| 0.9145833333333333 | 0 |
| 0.9152777777777777 | 0 |
| 0.9159722222222223 | 0 |
| 0.9166666666666666 | 0 |
| 0.9173611111111111 | 0 |
| 0.9180555555555556 | 0 |
| 0.9187500000000001 | 0 |
| 0.9194444444444444 | 0 |
| 0.9201388888888888 | 0 |
| 0.9208333333333334 | 0 |
| 0.9215277777777778 | 0 |
| 0.9222222222222222 | 0 |
| 0.9229166666666666 | 0 |
| 0.9236111111111112 | 0 |
| 0.9243055555555556 | 0 |
| 0.9249999999999999 | 0 |
| 0.9256944444444444 | 0 |
| 0.9263888888888889 | 0 |
| 0.9270833333333334 | 0 |
| 0.9277777777777777 | 0 |
| 0.9284722222222223 | 0 |
| 0.9291666666666667 | 0 |
| 0.9298611111111111 | 0 |
| 0.9305555555555555 | 0 |
| 0.93125 | 0 |
| 0.9319444444444445 | 0 |
| 0.9326388888888889 | 0 |
| 0.9333333333333332 | 0 |
| 0.9340277777777778 | 0 |
| 0.9347222222222222 | 0 |
| 0.9354166666666667 | 0 |
| 0.936111111111111 | 0 |
| 0.9368055555555556 | 0 |
| 0.9375 | 0 |
| 0.9381944444444444 | 0 |
| 0.938888888888889 | 0 |
| 0.9395833333333333 | 0 |
| 0.9402777777777778 | 0 |
| 0.9409722222222222 | 0 |
| 0.9416666666666668 | 0 |
| 0.9423611111111111 | 0 |
| 0.9430555555555555 | 0 |
| 0.94375 | 0 |
| 0.9444444444444445 | 0 |
| 0.9451388888888889 | 0 |
| 0.9458333333333333 | 0 |
| 0.9465277777777777 | 0 |
| 0.9472222222222223 | 0 |
| 0.9479166666666666 | 0 |
| 0.9486111111111111 | 0 |
| 0.9493055555555556 | 0 |
| 0.9500000000000001 | 0 |
| 0.9506944444444444 | 0 |
| 0.9513888888888888 | 0 |
| 0.9520833333333334 | 0 |
| 0.9527777777777778 | 0 |
| 0.9534722222222222 | 0 |
| 0.9541666666666666 | 0 |
| 0.9548611111111112 | 0 |
| 0.9555555555555556 | 0 |
| 0.9562499999999999 | 0 |
| 0.9569444444444444 | 0 |
| 0.9576388888888889 | 0 |
| 0.9583333333333334 | 0 |
| 0.9590277777777777 | 0 |
| 0.9597222222222223 | 0 |
| 0.9604166666666667 | 0 |
| 0.9611111111111111 | 0 |
| 0.9618055555555555 | 0 |
| 0.9625 | 0 |
| 0.9631944444444445 | 0 |
| 0.9638888888888889 | 0 |
| 0.9645833333333332 | 0 |
| 0.9652777777777778 | 0 |
| 0.9659722222222222 | 0 |
| 0.9666666666666667 | 0 |
| 0.967361111111111 | 0 |
| 0.9680555555555556 | 0 |
| 0.96875 | 0 |
| 0.9694444444444444 | 0 |
| 0.970138888888889 | 0 |
| 0.9708333333333333 | 0 |
| 0.9715277777777778 | 0 |
| 0.9722222222222222 | 0 |
| 0.9729166666666668 | 0 |
| 0.9736111111111111 | 0 |
| 0.9743055555555555 | 0 |
| 0.975 | 0 |
| 0.9756944444444445 | 0 |
| 0.9763888888888889 | 0 |
| 0.9770833333333333 | 0 |
| 0.9777777777777777 | 0 |
| 0.9784722222222223 | 0 |
| 0.9791666666666666 | 0 |
| 0.9798611111111111 | 0 |
| 0.9805555555555556 | 0 |
| 0.9812500000000001 | 0 |
| 0.9819444444444444 | 0 |
| 0.9826388888888888 | 0 |
| 0.9833333333333334 | 0 |
| 0.9840277777777778 | 0 |
| 0.9847222222222222 | 0 |
| 0.9854166666666666 | 0 |
| 0.9861111111111112 | 0 |
| 0.9868055555555556 | 0 |
| 0.9874999999999999 | 0 |
| 0.9881944444444444 | 0 |
| 0.9888888888888889 | 0 |
| 0.9895833333333334 | 0 |
| 0.9902777777777777 | 0 |
| 0.9909722222222223 | 0 |
| 0.9916666666666667 | 0 |
| 0.9923611111111111 | 0 |
| 0.9930555555555555 | 0 |
| 0.99375 | 0 |
| 0.9944444444444445 | 0 |
| 0.9951388888888889 | 0 |
| 0.9958333333333332 | 0 |
| 0.9965277777777778 | 0 |
| 0.9972222222222222 | 0 |
| 0.9979166666666667 | 0 |
| 0.998611111111111 | 0 |
| 0.9993055555555556 | 0 |